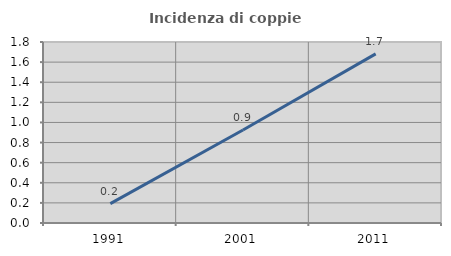
| Category | Incidenza di coppie miste |
|---|---|
| 1991.0 | 0.193 |
| 2001.0 | 0.925 |
| 2011.0 | 1.682 |